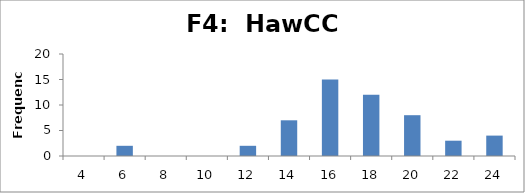
| Category | Frequency |
|---|---|
| 4.0 | 0 |
| 6.0 | 2 |
| 8.0 | 0 |
| 10.0 | 0 |
| 12.0 | 2 |
| 14.0 | 7 |
| 16.0 | 15 |
| 18.0 | 12 |
| 20.0 | 8 |
| 22.0 | 3 |
| 24.0 | 4 |